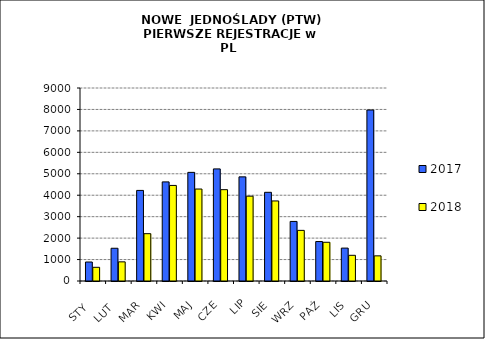
| Category | 2017 | 2018 |
|---|---|---|
|  STY  | 886 | 639 |
|  LUT  | 1527 | 893 |
| MAR | 4224 | 2207 |
| KWI | 4621 | 4457 |
| MAJ | 5066 | 4289 |
| CZE | 5227 | 4259 |
| LIP | 4856 | 3956 |
| SIE | 4136 | 3733 |
| WRZ | 2778 | 2361 |
| PAŹ | 1840 | 1806 |
| LIS | 1534 | 1198 |
| GRU | 7974 | 1173 |